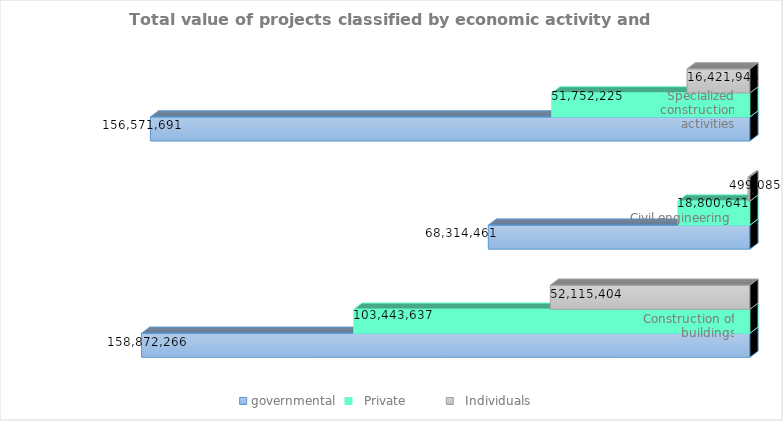
| Category |  governmental  |    Private          |    Individuals    |
|---|---|---|---|
|  Construction of buildings | 158872266 | 103443637 | 52115404 |
| Civil engineering | 68314461 | 18800641 | 499085 |
| Specialized construction activities | 156571691 | 51752225 | 16421944 |